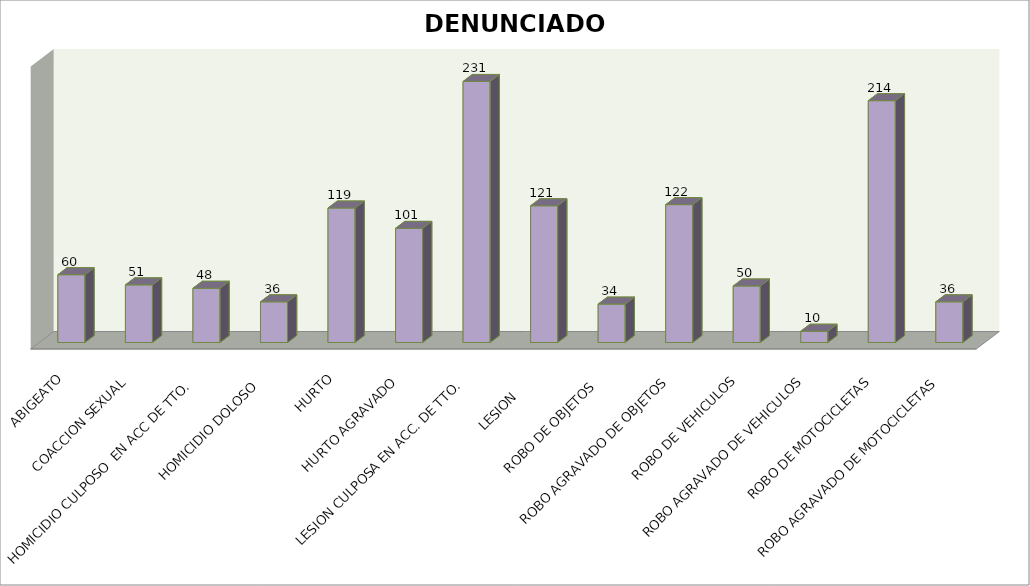
| Category | DENUNCIADOS |
|---|---|
| ABIGEATO | 60 |
| COACCION SEXUAL | 51 |
| HOMICIDIO CULPOSO  EN ACC DE TTO.  | 48 |
| HOMICIDIO DOLOSO  | 36 |
| HURTO | 119 |
| HURTO AGRAVADO | 101 |
| LESION CULPOSA EN ACC. DE TTO. | 231 |
| LESION      | 121 |
| ROBO DE OBJETOS  | 34 |
| ROBO AGRAVADO DE OBJETOS | 122 |
| ROBO DE VEHICULOS | 50 |
| ROBO AGRAVADO DE VEHICULOS | 10 |
| ROBO DE MOTOCICLETAS | 214 |
| ROBO AGRAVADO DE MOTOCICLETAS | 36 |